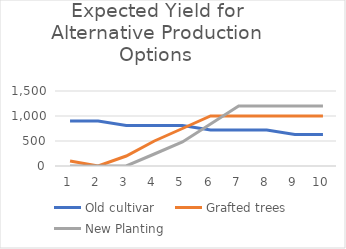
| Category | Old cultivar | Grafted trees | New Planting |
|---|---|---|---|
| 0 | 900 | 100 | 0 |
| 1 | 900 | 0 | 0 |
| 2 | 810 | 200 | 0 |
| 3 | 810 | 500 | 240 |
| 4 | 810 | 750 | 480 |
| 5 | 720 | 1000 | 840 |
| 6 | 720 | 1000 | 1200 |
| 7 | 720 | 1000 | 1200 |
| 8 | 630 | 1000 | 1200 |
| 9 | 630 | 1000 | 1200 |